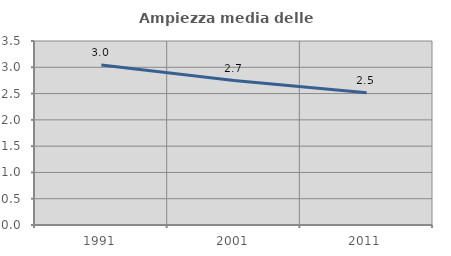
| Category | Ampiezza media delle famiglie |
|---|---|
| 1991.0 | 3.043 |
| 2001.0 | 2.747 |
| 2011.0 | 2.516 |